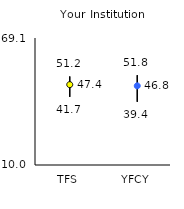
| Category | 25th | 75th | Mean |
|---|---|---|---|
| TFS | 41.7 | 51.2 | 47.4 |
| YFCY | 39.4 | 51.8 | 46.84 |